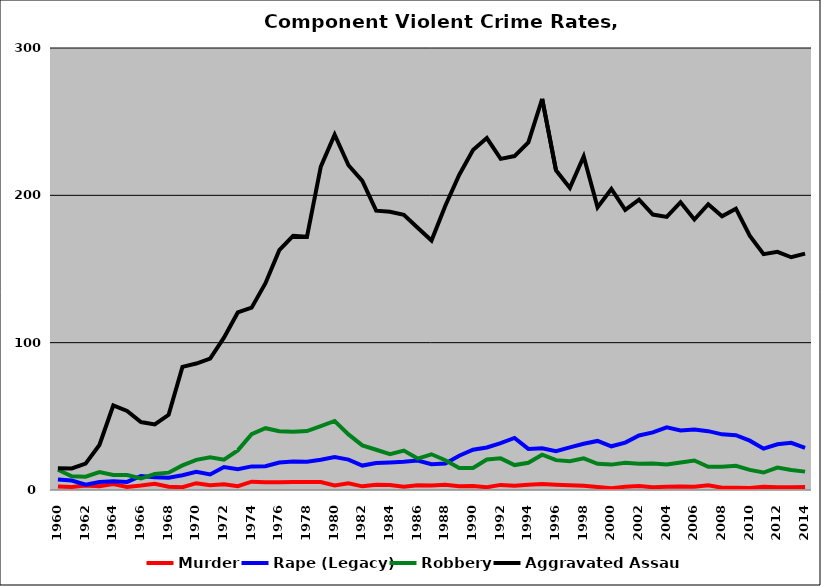
| Category | Murder | Rape (Legacy) | Robbery | Aggravated Assault |
|---|---|---|---|---|
| 1960.0 | 2.398 | 7.194 | 13.789 | 14.838 |
| 1961.0 | 2.047 | 6.433 | 9.357 | 14.62 |
| 1962.0 | 3.009 | 3.582 | 9.026 | 17.908 |
| 1963.0 | 2.525 | 5.47 | 12.202 | 30.575 |
| 1964.0 | 4.046 | 5.925 | 10.26 | 57.37 |
| 1965.0 | 2.023 | 5.491 | 10.116 | 53.613 |
| 1966.0 | 3.026 | 9.51 | 7.781 | 46.11 |
| 1967.0 | 4.292 | 8.727 | 10.873 | 44.492 |
| 1968.0 | 2.27 | 8.369 | 11.773 | 51.064 |
| 1969.0 | 1.95 | 10.028 | 16.713 | 83.565 |
| 1970.0 | 4.628 | 12.342 | 20.477 | 85.834 |
| 1971.0 | 3.279 | 10.519 | 22.268 | 89.208 |
| 1972.0 | 3.836 | 15.608 | 20.635 | 103.439 |
| 1973.0 | 2.597 | 14.156 | 26.883 | 120.519 |
| 1974.0 | 5.632 | 16.02 | 37.922 | 123.78 |
| 1975.0 | 5.244 | 16.098 | 41.951 | 140.366 |
| 1976.0 | 5.295 | 18.652 | 39.952 | 162.816 |
| 1977.0 | 5.484 | 19.37 | 39.557 | 172.462 |
| 1978.0 | 5.353 | 19.248 | 39.977 | 171.868 |
| 1979.0 | 5.414 | 20.552 | 43.315 | 219.448 |
| 1980.0 | 3.073 | 22.36 | 46.84 | 241.091 |
| 1981.0 | 4.484 | 20.647 | 37.748 | 220.438 |
| 1982.0 | 2.487 | 16.58 | 30.259 | 209.845 |
| 1983.0 | 3.539 | 18.301 | 27.3 | 189.585 |
| 1984.0 | 3.397 | 18.681 | 24.376 | 188.811 |
| 1985.0 | 2.189 | 19.104 | 26.766 | 186.766 |
| 1986.0 | 3.19 | 20.04 | 21.336 | 177.966 |
| 1987.0 | 3.106 | 17.535 | 24.248 | 169.339 |
| 1988.0 | 3.604 | 17.918 | 20.22 | 192.993 |
| 1989.0 | 2.564 | 23.274 | 14.99 | 213.807 |
| 1990.0 | 2.682 | 27.316 | 14.999 | 230.743 |
| 1991.0 | 1.829 | 28.874 | 20.693 | 238.884 |
| 1992.0 | 3.468 | 31.771 | 21.462 | 224.742 |
| 1993.0 | 2.912 | 35.305 | 16.924 | 226.661 |
| 1994.0 | 3.53 | 27.891 | 18.447 | 235.922 |
| 1995.0 | 4.127 | 28.375 | 23.99 | 265.52 |
| 1996.0 | 3.616 | 26.325 | 20.269 | 216.989 |
| 1997.0 | 3.223 | 28.926 | 19.587 | 205.041 |
| 1998.0 | 2.929 | 31.408 | 21.481 | 226.363 |
| 1999.0 | 1.997 | 33.315 | 17.816 | 191.819 |
| 2000.0 | 1.237 | 29.677 | 17.234 | 204.335 |
| 2001.0 | 2.272 | 32.183 | 18.552 | 190.143 |
| 2002.0 | 2.68 | 37.003 | 17.869 | 197.003 |
| 2003.0 | 1.902 | 39.136 | 17.922 | 186.974 |
| 2004.0 | 2.222 | 42.576 | 17.274 | 185.358 |
| 2005.0 | 2.449 | 40.368 | 18.61 | 195.331 |
| 2006.0 | 2.182 | 41.119 | 20.048 | 183.571 |
| 2007.0 | 3.268 | 39.949 | 15.74 | 193.944 |
| 2008.0 | 1.506 | 37.774 | 15.777 | 185.728 |
| 2009.0 | 1.553 | 37.198 | 16.432 | 190.969 |
| 2010.0 | 1.34 | 33.491 | 13.652 | 172.559 |
| 2011.0 | 2.21 | 28.035 | 11.871 | 160.064 |
| 2012.0 | 1.88 | 31.023 | 15.229 | 161.696 |
| 2013.0 | 1.798 | 31.993 | 13.641 | 157.982 |
| 2014.0 | 1.958 | 28.633 | 12.481 | 160.481 |